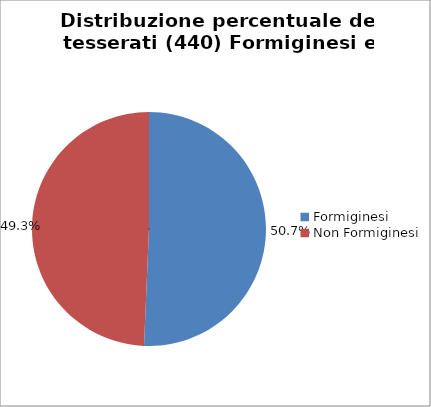
| Category | Nr. Tesserati |
|---|---|
| Formiginesi | 223 |
| Non Formiginesi | 217 |